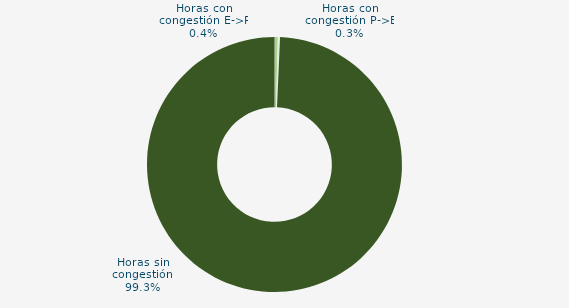
| Category | Horas con congestión E->P |
|---|---|
| Horas con congestión E->P | 0.417 |
| Horas con congestión P->E | 0.278 |
| Horas sin congestión | 99.306 |